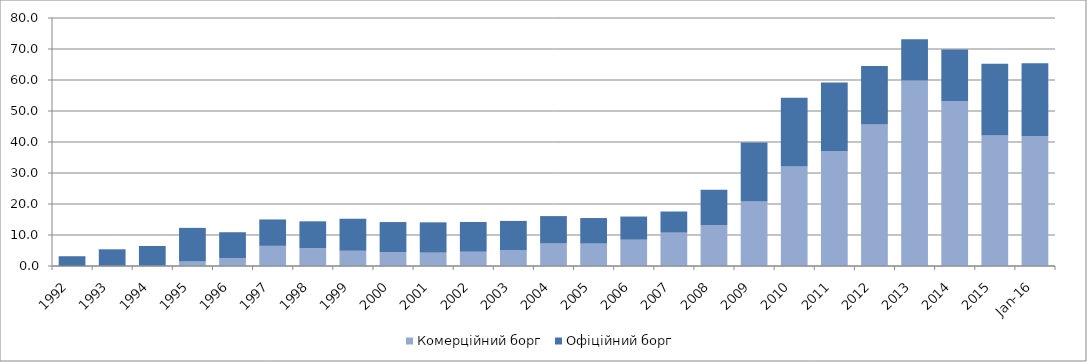
| Category | Комерційний борг | Офіційний борг |
|---|---|---|
| 1992.0 | 0.002 | 3.145 |
| 1993.0 | 0.093 | 5.294 |
| 1994.0 | 0.141 | 6.319 |
| 1995.0 | 1.452 | 10.845 |
| 1996.0 | 2.584 | 8.306 |
| 1997.0 | 6.501 | 8.515 |
| 1998.0 | 5.762 | 8.647 |
| 1999.0 | 4.91 | 10.338 |
| 2000.0 | 4.437 | 9.735 |
| 2001.0 | 4.31 | 9.775 |
| 2002.0 | 4.609 | 9.593 |
| 2003.0 | 5.066 | 9.477 |
| 2004.0 | 7.274 | 8.823 |
| 2005.0 | 7.225 | 8.249 |
| 2006.0 | 8.489 | 7.461 |
| 2007.0 | 10.762 | 6.811 |
| 2008.0 | 13.215 | 11.384 |
| 2009.0 | 20.831 | 18.982 |
| 2010.0 | 32.087 | 22.211 |
| 2011.0 | 37.025 | 22.198 |
| 2012.0 | 45.621 | 18.875 |
| 2013.0 | 59.842 | 13.321 |
| 2014.0 | 53.19 | 16.622 |
| 2015.0 | 42.095 | 23.175 |
| 42400.0 | 41.891 | 23.519 |